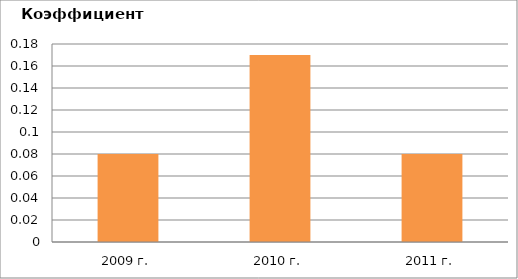
| Category | Series 0 |
|---|---|
| 2009 г. | 0.08 |
| 2010 г. | 0.17 |
| 2011 г. | 0.08 |